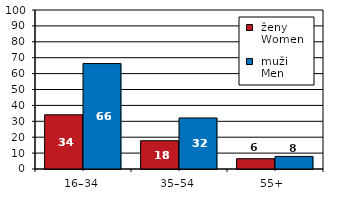
| Category |  ženy 
 Women |  muži 
 Men |
|---|---|---|
| 16–34 | 34.107 | 66.31 |
| 35–54 | 17.781 | 32.094 |
| 55+  | 6.477 | 7.895 |